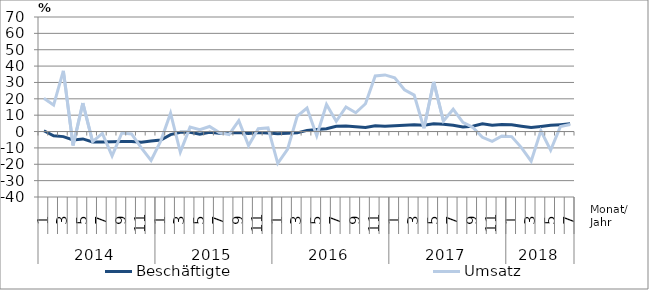
| Category | Beschäftigte | Umsatz |
|---|---|---|
| 0 | 0.5 | 20.3 |
| 1 | -2.6 | 16.2 |
| 2 | -3.1 | 37.1 |
| 3 | -5.1 | -8.5 |
| 4 | -4.5 | 17.4 |
| 5 | -6.4 | -6.1 |
| 6 | -6.4 | -1.1 |
| 7 | -6.2 | -14.9 |
| 8 | -6.1 | -0.9 |
| 9 | -6.1 | -1.5 |
| 10 | -6.6 | -10 |
| 11 | -5.8 | -17.6 |
| 12 | -5.2 | -5.7 |
| 13 | -1.9 | 11.2 |
| 14 | -0.5 | -12.5 |
| 15 | -0.5 | 2.7 |
| 16 | -1.7 | 1.2 |
| 17 | -0.5 | 3.1 |
| 18 | -1.1 | -0.6 |
| 19 | -0.8 | -1.8 |
| 20 | -0.6 | 6.7 |
| 21 | -1.2 | -8.6 |
| 22 | -0.6 | 1.7 |
| 23 | -0.9 | 2.2 |
| 24 | -1.3 | -19.4 |
| 25 | -1.1 | -10.9 |
| 26 | -0.8 | 9.4 |
| 27 | 0.7 | 14.4 |
| 28 | 1.2 | -2.6 |
| 29 | 1.7 | 16.5 |
| 30 | 3.2 | 6.3 |
| 31 | 3.4 | 15 |
| 32 | 3 | 11.5 |
| 33 | 2.5 | 17 |
| 34 | 3.6 | 34 |
| 35 | 3.2 | 34.6 |
| 36 | 3.5 | 32.8 |
| 37 | 3.8 | 25.5 |
| 38 | 4.2 | 22.3 |
| 39 | 3.9 | 2 |
| 40 | 4.7 | 30.3 |
| 41 | 4.4 | 6.4 |
| 42 | 3.9 | 13.6 |
| 43 | 2.8 | 5.6 |
| 44 | 3.3 | 2.6 |
| 45 | 4.7 | -3.5 |
| 46 | 3.8 | -6 |
| 47 | 4.3 | -2.7 |
| 48 | 4.2 | -3.1 |
| 49 | 3.3 | -9.8 |
| 50 | 2.5 | -18.1 |
| 51 | 3.1 | 0.5 |
| 52 | 3.8 | -11.4 |
| 53 | 4.2 | 3 |
| 54 | 4.7 | 4.3 |